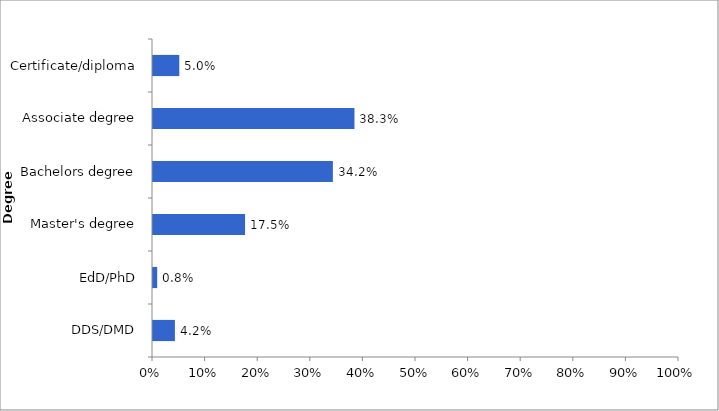
| Category | 2015-16 |
|---|---|
| DDS/DMD | 0.042 |
| EdD/PhD | 0.008 |
| Master's degree | 0.175 |
| Bachelors degree | 0.342 |
| Associate degree | 0.383 |
| Certificate/diploma | 0.05 |